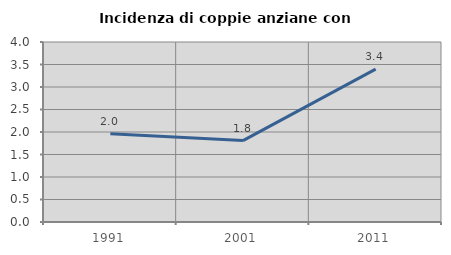
| Category | Incidenza di coppie anziane con figli |
|---|---|
| 1991.0 | 1.962 |
| 2001.0 | 1.809 |
| 2011.0 | 3.398 |